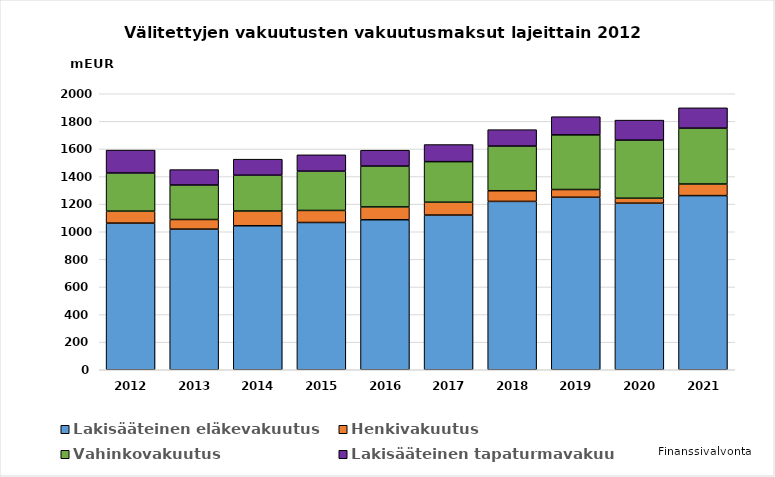
| Category | Lakisääteinen eläkevakuutus | Henkivakuutus | Vahinkovakuutus | Lakisääteinen tapaturmavakuutus |
|---|---|---|---|---|
| 2012.0 | 1062.705 | 86.597 | 276.62 | 165.706 |
| 2013.0 | 1019.216 | 69.648 | 249.823 | 111.515 |
| 2014.0 | 1043.573 | 106.619 | 259.835 | 115.957 |
| 2015.0 | 1067.062 | 87.285 | 284.943 | 118.153 |
| 2016.0 | 1087 | 93 | 296 | 115 |
| 2017.0 | 1121 | 93 | 294 | 124 |
| 2018.0 | 1220 | 77 | 324 | 119 |
| 2019.0 | 1250 | 56 | 396 | 132 |
| 2020.0 | 1207 | 36 | 421 | 145 |
| 2021.0 | 1262 | 84 | 405 | 147 |